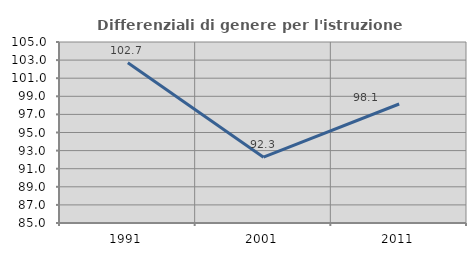
| Category | Differenziali di genere per l'istruzione superiore |
|---|---|
| 1991.0 | 102.703 |
| 2001.0 | 92.276 |
| 2011.0 | 98.147 |